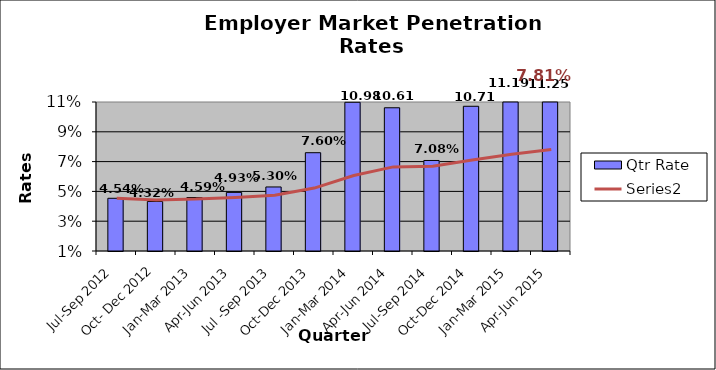
| Category | Qtr Rate |
|---|---|
| Jul-Sep 2012 | 0.045 |
| Oct- Dec 2012 | 0.043 |
| Jan-Mar 2013 | 0.046 |
| Apr-Jun 2013 | 0.049 |
| Jul -Sep 2013 | 0.053 |
| Oct-Dec 2013 | 0.076 |
| Jan-Mar 2014 | 0.11 |
| Apr-Jun 2014 | 0.106 |
| Jul-Sep 2014 | 0.071 |
| Oct-Dec 2014 | 0.107 |
| Jan-Mar 2015 | 0.112 |
| Apr-Jun 2015 | 0.112 |